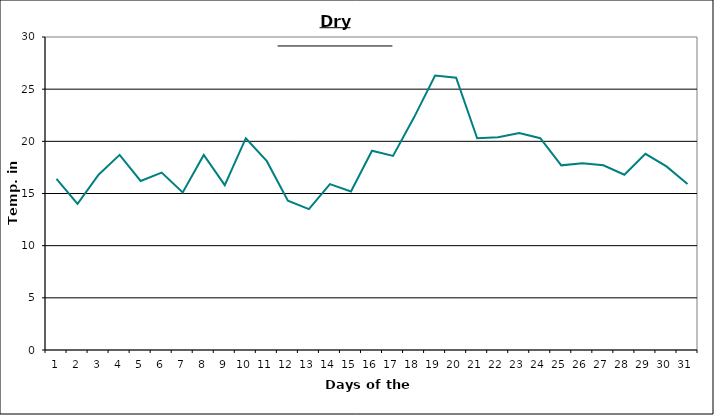
| Category | Series 0 |
|---|---|
| 0 | 16.4 |
| 1 | 14 |
| 2 | 16.8 |
| 3 | 18.7 |
| 4 | 16.2 |
| 5 | 17 |
| 6 | 15.1 |
| 7 | 18.7 |
| 8 | 15.8 |
| 9 | 20.3 |
| 10 | 18.1 |
| 11 | 14.3 |
| 12 | 13.5 |
| 13 | 15.9 |
| 14 | 15.2 |
| 15 | 19.1 |
| 16 | 18.6 |
| 17 | 22.3 |
| 18 | 26.3 |
| 19 | 26.1 |
| 20 | 20.3 |
| 21 | 20.4 |
| 22 | 20.8 |
| 23 | 20.3 |
| 24 | 17.7 |
| 25 | 17.9 |
| 26 | 17.7 |
| 27 | 16.8 |
| 28 | 18.8 |
| 29 | 17.6 |
| 30 | 15.9 |